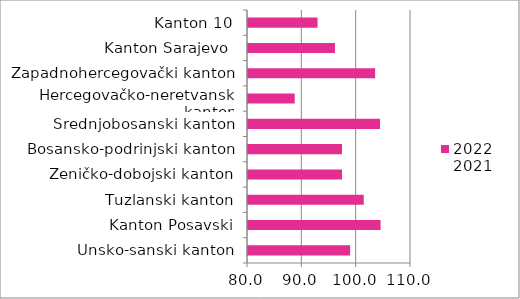
| Category | 2022
2021 |
|---|---|
| Unsko-sanski kanton | 98.8 |
| Kanton Posavski | 104.4 |
| Tuzlanski kanton | 101.3 |
| Zeničko-dobojski kanton | 97.3 |
| Bosansko-podrinjski kanton | 97.3 |
| Srednjobosanski kanton | 104.3 |
| Hercegovačko-neretvanski kanton | 88.6 |
| Zapadnohercegovački kanton | 103.4 |
| Kanton Sarajevo  | 96 |
| Kanton 10 | 92.8 |